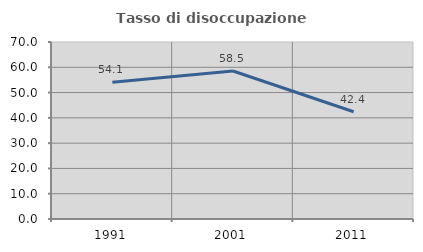
| Category | Tasso di disoccupazione giovanile  |
|---|---|
| 1991.0 | 54.054 |
| 2001.0 | 58.537 |
| 2011.0 | 42.424 |